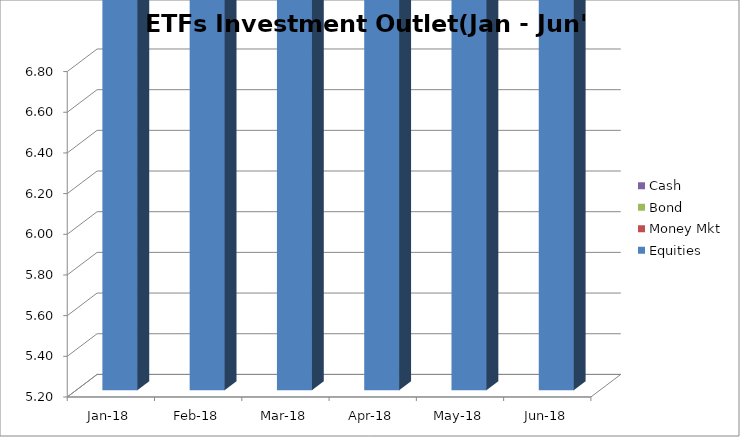
| Category | Equities | Money Mkt | Bond | Cash |
|---|---|---|---|---|
| 2018-01-01 | 6042563240.56 | 136904370.35 | 461893095.23 | 38893765.13 |
| 2018-02-01 | 5921870729.43 | 151252495.1 | 464176980.34 | 64897422.63 |
| 2018-03-01 | 5680580702.11 | 178223610.44 | 461242108.34 | 47114040.72 |
| 2018-04-01 | 5916812401.32 | 236436196.19 | 473183326.33 | 59989270.56 |
| 2018-05-01 | 5604937403.21 | 163325823.53 | 470433442.99 | 82279978.28 |
| 2018-06-01 | 5688266618.66 | 146073161.64 | 483544793.6 | 144539302.66 |